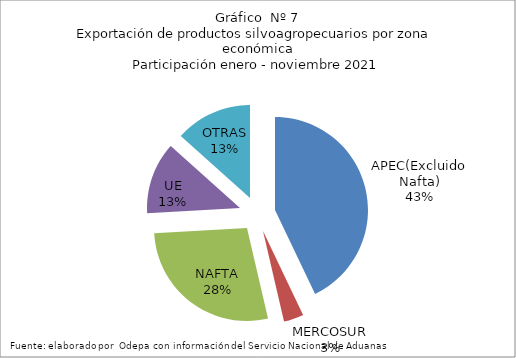
| Category | Series 0 |
|---|---|
| APEC(Excluido Nafta) | 6740197.911 |
| MERCOSUR | 543961.032 |
| NAFTA | 4355839.06 |
| UE | 1969194.637 |
| OTRAS | 2100330.362 |